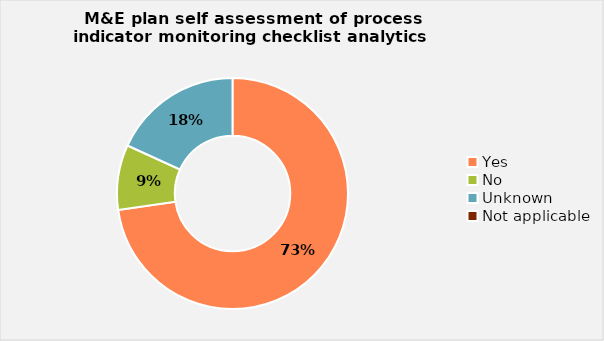
| Category | Percentage  |
|---|---|
| Yes | 0.727 |
| No | 0.091 |
| Unknown | 0.182 |
| Not applicable  | 0 |